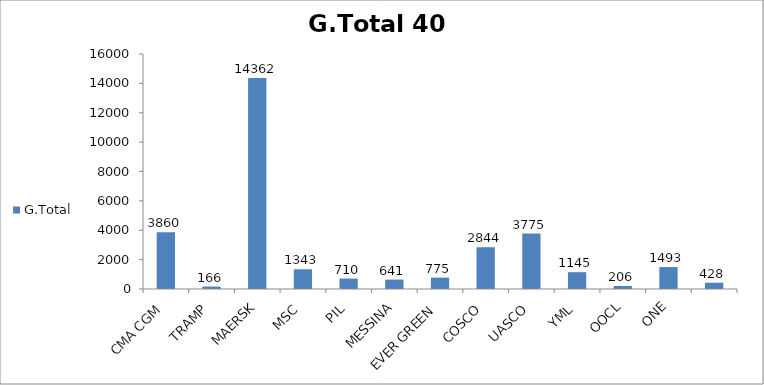
| Category | G.Total |
|---|---|
| CMA CGM | 3860 |
| TRAMP | 166 |
| MAERSK | 14362 |
| MSC | 1343 |
| PIL | 710 |
| MESSINA | 641 |
| EVER GREEN | 775 |
| COSCO | 2844 |
| UASCO | 3775 |
| YML | 1145 |
| OOCL | 206 |
| ONE | 1493 |